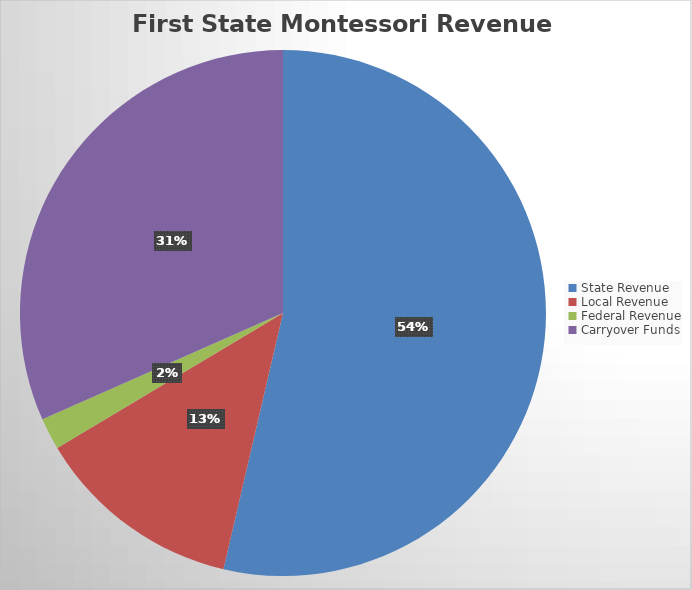
| Category | Series 0 |
|---|---|
| State Revenue | 4588763 |
| Local Revenue | 1093995.26 |
| Federal Revenue | 167344 |
| Carryover Funds | 2704941.32 |